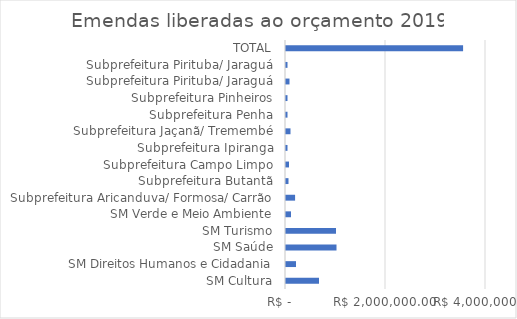
| Category | Series 0 |
|---|---|
| SM Cultura | 660000 |
| SM Direitos Humanos e Cidadania | 200000 |
| SM Saúde | 1010000 |
| SM Turismo | 1000000 |
| SM Verde e Meio Ambiente | 100000 |
| Subprefeitura Aricanduva/ Formosa/ Carrão | 181818 |
| Subprefeitura Butantã | 50000 |
| Subprefeitura Campo Limpo | 60000 |
| Subprefeitura Ipiranga | 30000 |
| Subprefeitura Jaçanã/ Tremembé | 90000 |
| Subprefeitura Penha | 30000 |
| Subprefeitura Pinheiros | 30000 |
| Subprefeitura Pirituba/ Jaraguá | 70000 |
| Subprefeitura Pirituba/ Jaraguá | 30000 |
| TOTAL | 3541818 |